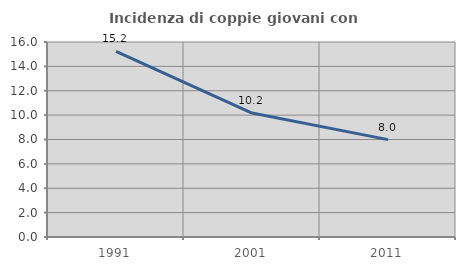
| Category | Incidenza di coppie giovani con figli |
|---|---|
| 1991.0 | 15.222 |
| 2001.0 | 10.169 |
| 2011.0 | 7.989 |